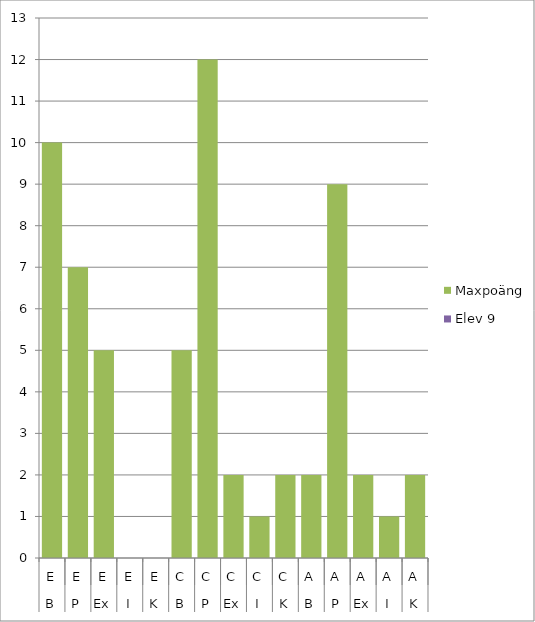
| Category | Maxpoäng | Elev 9 |
|---|---|---|
| 0 | 10 | 0 |
| 1 | 7 | 0 |
| 2 | 5 | 0 |
| 3 | 0 | 0 |
| 4 | 0 | 0 |
| 5 | 5 | 0 |
| 6 | 12 | 0 |
| 7 | 2 | 0 |
| 8 | 1 | 0 |
| 9 | 2 | 0 |
| 10 | 2 | 0 |
| 11 | 9 | 0 |
| 12 | 2 | 0 |
| 13 | 1 | 0 |
| 14 | 2 | 0 |